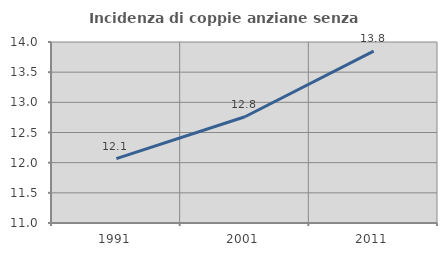
| Category | Incidenza di coppie anziane senza figli  |
|---|---|
| 1991.0 | 12.067 |
| 2001.0 | 12.761 |
| 2011.0 | 13.85 |